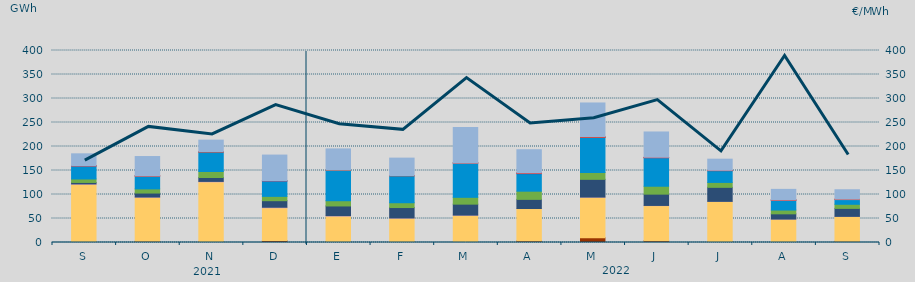
| Category | Carbón | Ciclo Combinado | Cogeneración | Consumo Bombeo | Eólica | Hidráulica | Nuclear | Otras Renovables | Solar fotovoltaica | Solar térmica | Turbinación bombeo |
|---|---|---|---|---|---|---|---|---|---|---|---|
| S | 929.2 | 120567.6 | 582.6 | 3027.8 | 7256.6 | 27279.3 | 289.1 | 9.8 | 66.3 | 68.7 | 24660.8 |
| O | 2449.3 | 91772.5 | 539.6 | 8249.9 | 8677.5 | 26982.9 | 0 | 3.2 | 196.7 | 36.5 | 40197.4 |
| N | 1901 | 124474.7 | 919.8 | 8069.5 | 12499.1 | 40973.4 | 0.4 | 0 | 312.6 | 0.3 | 24114.5 |
| D | 3972.3 | 68425.3 | 1069.5 | 13639.4 | 9010.9 | 31863.1 | 841.6 | 0.5 | 182.8 | 0 | 53138.5 |
| E | 1857.5 | 53248.9 | 859.7 | 20175.8 | 10885.7 | 63478.2 | 410.2 | 0 | 271.2 | 0 | 43785.9 |
| F | 1422.4 | 49296.1 | 416.6 | 21707.5 | 9996.4 | 56385.2 | 0 | 0 | 73.3 | 57.8 | 36436.3 |
| M | 696.5 | 56010.8 | 391.8 | 22798.3 | 14218 | 71626.6 | 0 | 7.4 | 87.7 | 6.7 | 73580.2 |
| A | 3349.534 | 67415.187 | 93.591 | 18989.102 | 17056.874 | 36445.011 | 1248.7 | 45.8 | 106.634 | 333.066 | 48166.851 |
| M | 10012.495 | 84316.131 | 342.191 | 36920.803 | 14355.123 | 73448.126 | 0.3 | 0 | 350.4 | 549.325 | 70399.534 |
| J | 3803.776 | 72994.164 | 408.816 | 23523.459 | 16484.811 | 59296.475 | 327.825 | 3.325 | 281.65 | 342.175 | 52808.788 |
| J | 2026.357 | 83630.229 | 62.5 | 29193.443 | 10247.658 | 24517.982 | 107.35 | 0 | 186.925 | 340.15 | 23284.195 |
| A | 608.425 | 48201.184 | 25.75 | 10881.743 | 7912.923 | 20661.25 | 49.5 | 8.225 | 251.425 | 88.725 | 21982.08 |
| S | 2432.475 | 52018.85 | 0.5 | 16627 | 8549.825 | 9810.3 | 0 | 23 | 777.175 | 6.75 | 19642.325 |